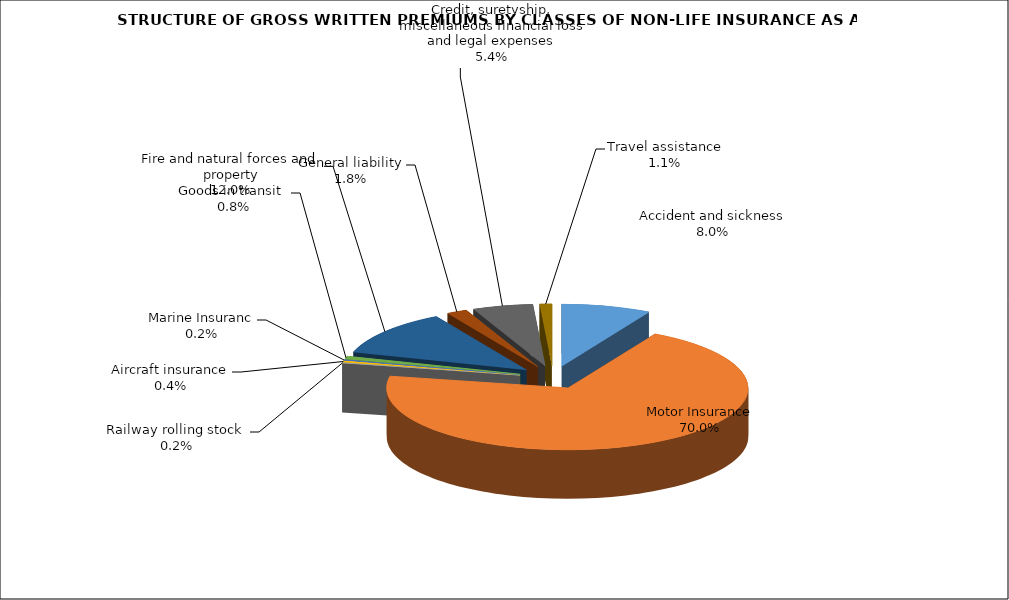
| Category | Accident and sickness | Series 1 |
|---|---|---|
| Accident and sickness | 0.08 |  |
| Motor Insurance | 0.7 |  |
| Railway rolling stock  | 0.002 |  |
| Aircraft insurance | 0.004 |  |
| Marine Insuranc | 0.002 |  |
| Goods in transit  | 0.008 |  |
| Fire and natural forces and property | 0.12 |  |
| General liability | 0.018 |  |
| Credit, suretyship, miscellaneous financial loss and legal expenses | 0.054 |  |
| Travel assistance | 0.011 |  |